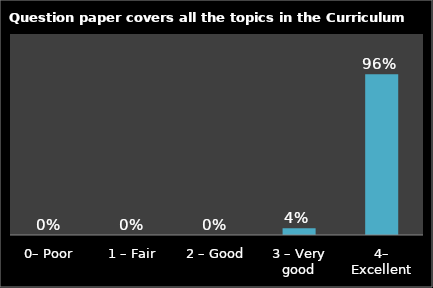
| Category | Series 0 |
|---|---|
| 0– Poor | 0 |
| 1 – Fair | 0 |
| 2 – Good | 0 |
| 3 – Very good | 0.04 |
| 4– Excellent | 0.96 |